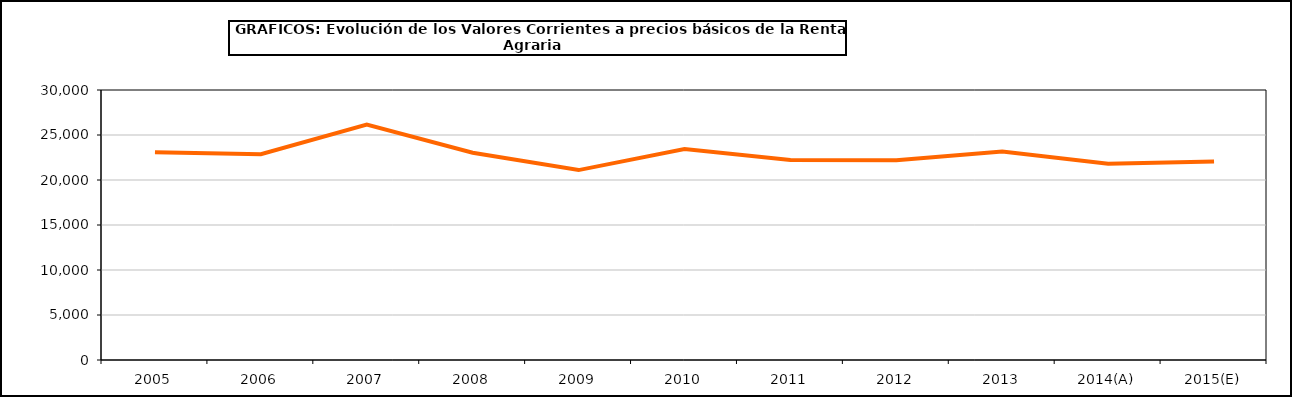
| Category | renta agraria |
|---|---|
| 2005 | 23073.983 |
| 2006 | 22863.5 |
| 2007 | 26149.9 |
| 2008 | 23031.6 |
| 2009 | 21101 |
| 2010 | 23433.2 |
| 2011 | 22219.2 |
| 2012 | 22193.5 |
| 2013 | 23161.5 |
| 2014(A) | 21808.8 |
| 2015(E) | 22063.6 |